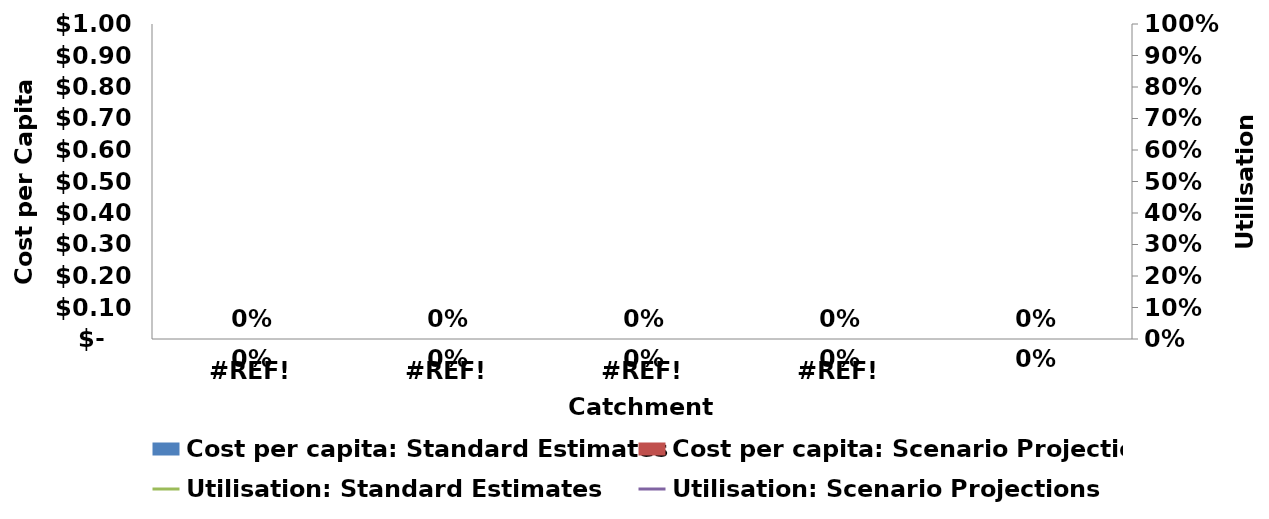
| Category | Cost per capita: Standard Estimates | Cost per capita: Scenario Projection |
|---|---|---|
| 0.0 | 0 | 0 |
| 0.0 | 0 | 0 |
| 0.0 | 0 | 0 |
| 0.0 | 0 | 0 |